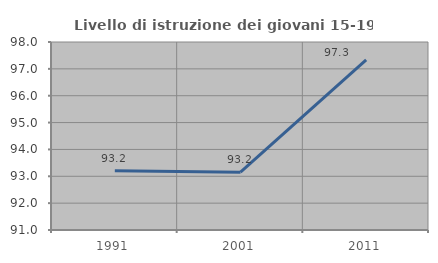
| Category | Livello di istruzione dei giovani 15-19 anni |
|---|---|
| 1991.0 | 93.204 |
| 2001.0 | 93.151 |
| 2011.0 | 97.333 |